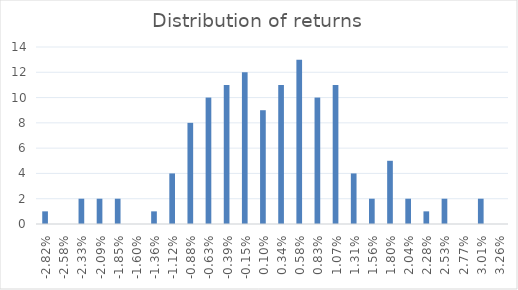
| Category | Series 0 |
|---|---|
| -0.028200561605154273 | 1 |
| -0.025769779826295292 | 0 |
| -0.02333899804743631 | 2 |
| -0.02090821626857733 | 2 |
| -0.01847743448971835 | 2 |
| -0.01604665271085937 | 0 |
| -0.013615870932000389 | 1 |
| -0.011185089153141408 | 4 |
| -0.008754307374282427 | 8 |
| -0.006323525595423446 | 10 |
| -0.003892743816564464 | 11 |
| -0.0014619620377054826 | 12 |
| 0.0009688197411534989 | 9 |
| 0.0033996015200124805 | 11 |
| 0.005830383298871462 | 13 |
| 0.008261165077730444 | 10 |
| 0.010691946856589425 | 11 |
| 0.013122728635448406 | 4 |
| 0.015553510414307387 | 2 |
| 0.017984292193166367 | 5 |
| 0.020415073972025348 | 2 |
| 0.02284585575088433 | 1 |
| 0.02527663752974331 | 2 |
| 0.02770741930860229 | 0 |
| 0.03013820108746127 | 2 |
| 0.032568982866320255 | 0 |